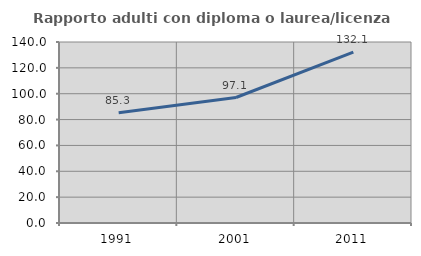
| Category | Rapporto adulti con diploma o laurea/licenza media  |
|---|---|
| 1991.0 | 85.304 |
| 2001.0 | 97.067 |
| 2011.0 | 132.121 |